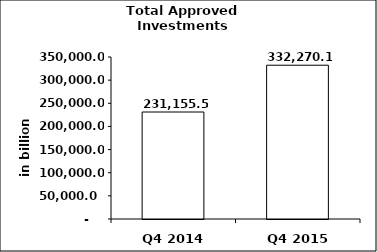
| Category | Series 0 |
|---|---|
| Q4 2014 | 231155.534 |
| Q4 2015 | 332270.062 |